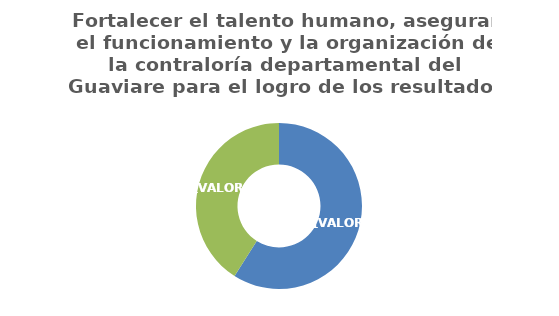
| Category | Fortalecer el talento humano, asegurar el funcionamiento y la organización de la contraloría departamental del Guaviare para el logro de los resultados |
|---|---|
| Avance 1° Semestre
(ejecución acumulada a junio de 2020) | 0.59 |
| Diferencia
(ejecución faltante para completar la meta establecida) | 0.41 |